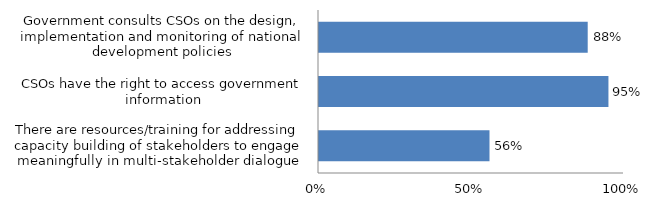
| Category | Series 0 |
|---|---|
| There are resources/training for addressing capacity building of stakeholders to engage meaningfully in multi-stakeholder dialogue | 0.559 |
| CSOs have the right to access government information | 0.949 |
| Government consults CSOs on the design, implementation and monitoring of national development policies | 0.881 |